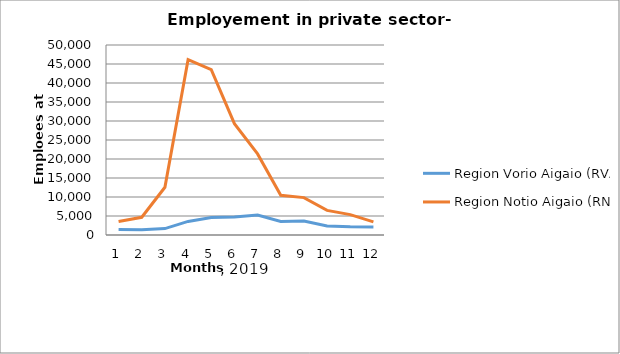
| Category | Region Vorio Aigaio (RVA) | Region Notio Aigaio (RNA) |
|---|---|---|
| 0 | 1465 | 3530 |
| 1 | 1400 | 4664 |
| 2 | 1695 | 12559 |
| 3 | 3574 | 46128 |
| 4 | 4612 | 43519 |
| 5 | 4762 | 29288 |
| 6 | 5231 | 21338 |
| 7 | 3573 | 10461 |
| 8 | 3706 | 9838 |
| 9 | 2365 | 6481 |
| 10 | 2148 | 5372 |
| 11 | 2104 | 3457 |